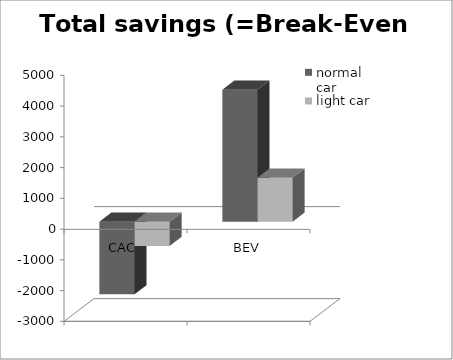
| Category | normal car | light car |
|---|---|---|
| CAC  | -2362.835 | -787.612 |
| BEV | 4292.312 | 1430.771 |